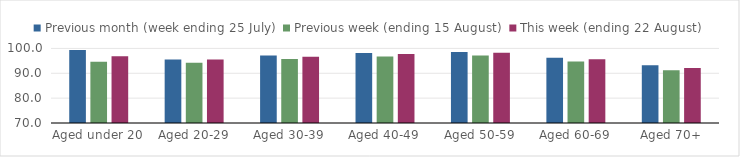
| Category | Previous month (week ending 25 July) | Previous week (ending 15 August) | This week (ending 22 August) |
|---|---|---|---|
| Aged under 20 | 99.331 | 94.616 | 96.851 |
| Aged 20-29 | 95.59 | 94.191 | 95.518 |
| Aged 30-39 | 97.122 | 95.708 | 96.692 |
| Aged 40-49 | 98.19 | 96.733 | 97.765 |
| Aged 50-59 | 98.544 | 97.153 | 98.277 |
| Aged 60-69 | 96.297 | 94.7 | 95.647 |
| Aged 70+ | 93.263 | 91.205 | 92.159 |